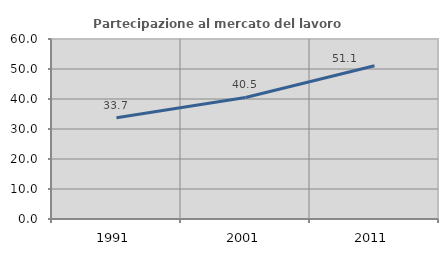
| Category | Partecipazione al mercato del lavoro  femminile |
|---|---|
| 1991.0 | 33.743 |
| 2001.0 | 40.526 |
| 2011.0 | 51.061 |